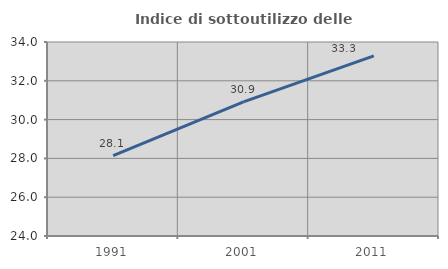
| Category | Indice di sottoutilizzo delle abitazioni  |
|---|---|
| 1991.0 | 28.147 |
| 2001.0 | 30.913 |
| 2011.0 | 33.283 |